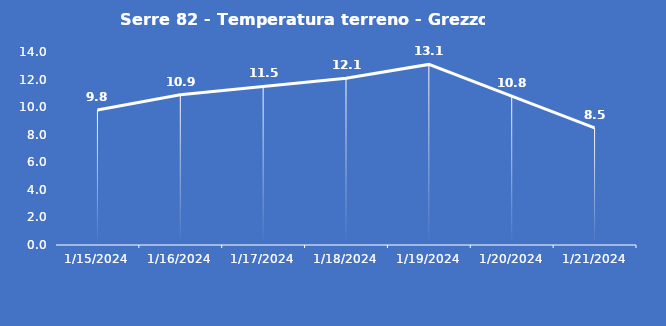
| Category | Serre 82 - Temperatura terreno - Grezzo (°C) |
|---|---|
| 1/15/24 | 9.8 |
| 1/16/24 | 10.9 |
| 1/17/24 | 11.5 |
| 1/18/24 | 12.1 |
| 1/19/24 | 13.1 |
| 1/20/24 | 10.8 |
| 1/21/24 | 8.5 |